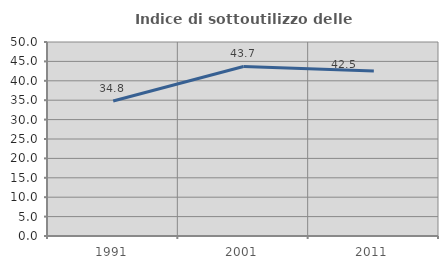
| Category | Indice di sottoutilizzo delle abitazioni  |
|---|---|
| 1991.0 | 34.783 |
| 2001.0 | 43.697 |
| 2011.0 | 42.5 |